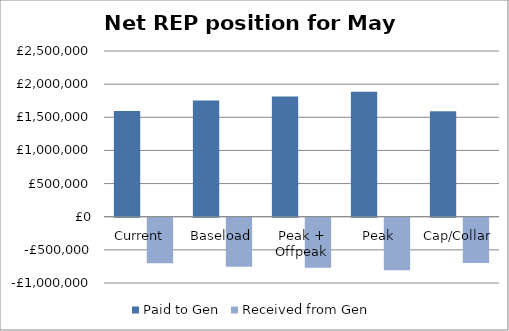
| Category | Paid to Gen | Received from Gen |
|---|---|---|
| Current  | 1592996.82 | -685136.49 |
| Baseload | 1752555.853 | -737906.864 |
| Peak + Offpeak | 1815434.444 | -755322.275 |
| Peak | 1884243.688 | -793353.517 |
| Cap/Collar | 1592680.243 | -684051.101 |